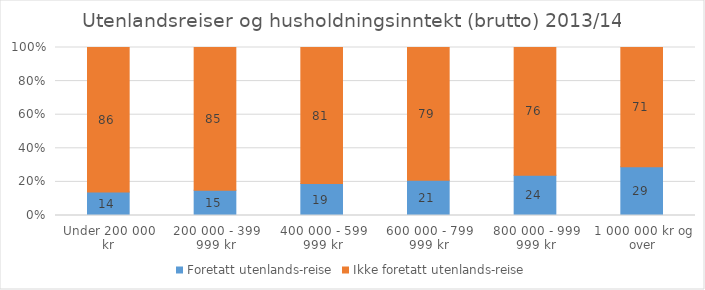
| Category | Foretatt utenlands-reise | Ikke foretatt utenlands-reise |
|---|---|---|
| Under 200 000 kr | 14 | 86 |
| 200 000 - 399 999 kr | 15 | 85 |
| 400 000 - 599 999 kr | 19 | 81 |
| 600 000 - 799 999 kr | 21 | 79 |
| 800 000 - 999 999 kr | 24 | 76 |
| 1 000 000 kr og over | 29 | 71 |